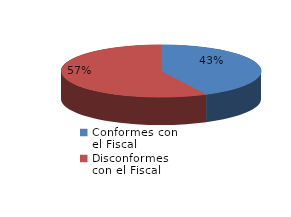
| Category | Series 0 |
|---|---|
| 0 | 1422 |
| 1 | 1919 |